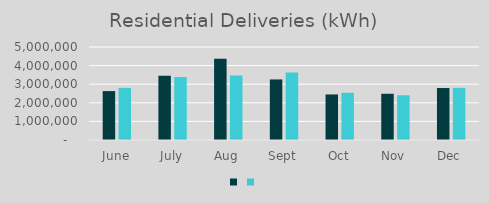
| Category | Series 1 | Series 0 |
|---|---|---|
| June | 2629934 | 2802052 |
| July | 3456641 | 3385366 |
| Aug | 4364840 | 3470448 |
| Sept | 3255766 | 3631455 |
| Oct | 2448610 | 2538922 |
| Nov | 2484917 | 2405818 |
| Dec | 2793607 | 2803771 |